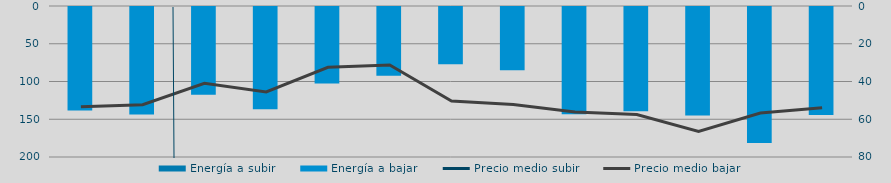
| Category | Energía a subir | Energía a bajar |
|---|---|---|
| D |  | 138.346 |
| E |  | 143.557 |
| F |  | 117.527 |
| M |  | 136.637 |
| A |  | 102.577 |
| M |  | 92.295 |
| J |  | 77.25 |
| J |  | 85.138 |
| A |  | 143.514 |
| S |  | 139.283 |
| O |  | 144.899 |
| N |  | 181.38 |
| D |  | 144.353 |